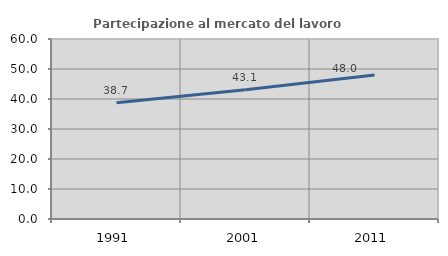
| Category | Partecipazione al mercato del lavoro  femminile |
|---|---|
| 1991.0 | 38.735 |
| 2001.0 | 43.064 |
| 2011.0 | 47.979 |